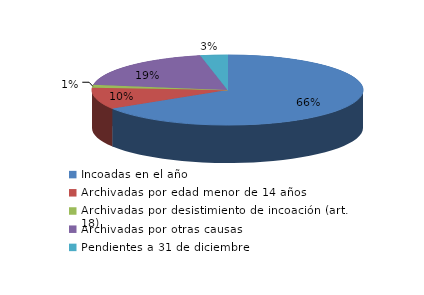
| Category | Series 0 |
|---|---|
| Incoadas en el año | 433 |
| Archivadas por edad menor de 14 años | 65 |
| Archivadas por desistimiento de incoación (art. 18) | 9 |
| Archivadas por otras causas | 127 |
| Pendientes a 31 de diciembre | 21 |